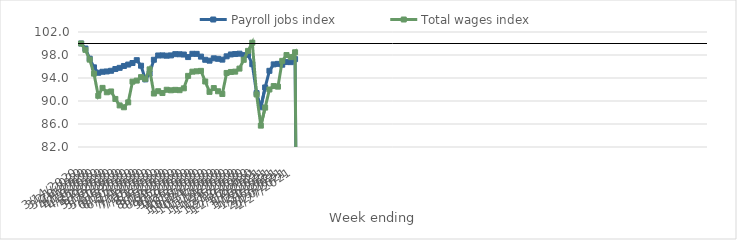
| Category | Payroll jobs index | Total wages index |
|---|---|---|
| 14/03/2020 | 100 | 100 |
| 21/03/2020 | 99.128 | 98.896 |
| 28/03/2020 | 97.359 | 97.193 |
| 04/04/2020 | 95.851 | 94.756 |
| 11/04/2020 | 94.906 | 90.911 |
| 18/04/2020 | 95.084 | 92.28 |
| 25/04/2020 | 95.137 | 91.518 |
| 02/05/2020 | 95.257 | 91.659 |
| 09/05/2020 | 95.561 | 90.358 |
| 16/05/2020 | 95.769 | 89.229 |
| 23/05/2020 | 96.091 | 88.908 |
| 30/05/2020 | 96.338 | 89.761 |
| 06/06/2020 | 96.608 | 93.366 |
| 13/06/2020 | 97.101 | 93.548 |
| 20/06/2020 | 96.138 | 94.151 |
| 27/06/2020 | 93.763 | 93.859 |
| 04/07/2020 | 94.782 | 95.503 |
| 11/07/2020 | 97.173 | 91.301 |
| 18/07/2020 | 97.918 | 91.702 |
| 25/07/2020 | 97.931 | 91.388 |
| 01/08/2020 | 97.878 | 91.955 |
| 08/08/2020 | 97.929 | 91.863 |
| 15/08/2020 | 98.149 | 91.939 |
| 22/08/2020 | 98.129 | 91.881 |
| 29/08/2020 | 98.08 | 92.201 |
| 05/09/2020 | 97.641 | 94.372 |
| 12/09/2020 | 98.209 | 95.099 |
| 19/09/2020 | 98.198 | 95.165 |
| 26/09/2020 | 97.72 | 95.242 |
| 03/10/2020 | 97.171 | 93.39 |
| 10/10/2020 | 97.016 | 91.589 |
| 17/10/2020 | 97.423 | 92.251 |
| 24/10/2020 | 97.338 | 91.694 |
| 31/10/2020 | 97.195 | 91.219 |
| 07/11/2020 | 97.772 | 94.875 |
| 14/11/2020 | 98.095 | 95.05 |
| 21/11/2020 | 98.167 | 95.108 |
| 28/11/2020 | 98.228 | 95.635 |
| 05/12/2020 | 97.979 | 97.165 |
| 12/12/2020 | 98.035 | 98.715 |
| 19/12/2020 | 96.398 | 100.14 |
| 26/12/2020 | 91.374 | 91.132 |
| 02/01/2021 | 88.905 | 85.717 |
| 09/01/2021 | 92.356 | 88.85 |
| 16/01/2021 | 95.248 | 92.002 |
| 23/01/2021 | 96.369 | 92.599 |
| 30/01/2021 | 96.456 | 92.497 |
| 06/02/2021 | 96.31 | 96.98 |
| 13/02/2021 | 96.771 | 97.994 |
| 20/02/2021 | 96.758 | 97.63 |
| 27/02/2021 | 97.28 | 98.473 |